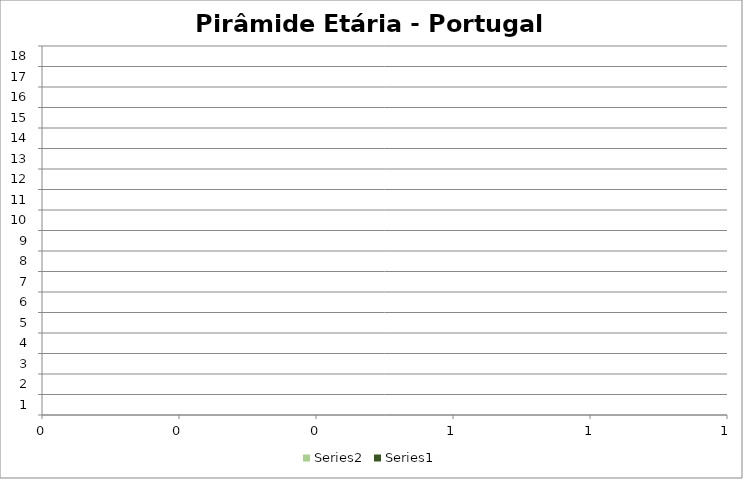
| Category | Series 1 | Series 0 |
|---|---|---|
| 0 | 210449 | -220012 |
| 1 | 228539 | -238215 |
| 2 | 249639 | -260712 |
| 3 | 270414 | -282330 |
| 4 | 265978 | -272727 |
| 5 | 274710 | -272620 |
| 6 | 293745 | -282370 |
| 7 | 357170 | -328594 |
| 8 | 419405 | -381711 |
| 9 | 406993 | -368384 |
| 10 | 395886 | -354097 |
| 11 | 386514 | -342424 |
| 12 | 357656 | -311098 |
| 13 | 333878 | -284295 |
| 14 | 301711 | -236729 |
| 15 | 246993 | -179163 |
| 16 | 214396 | -136786 |
| 17 | 210175 | -100099 |